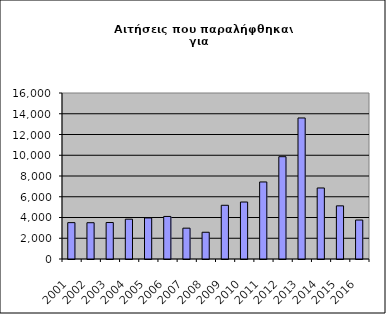
| Category | Series 0 |
|---|---|
| 2001.0 | 3505 |
| 2002.0 | 3497 |
| 2003.0 | 3516 |
| 2004.0 | 3838 |
| 2005.0 | 3956 |
| 2006.0 | 4101 |
| 2007.0 | 2972 |
| 2008.0 | 2577 |
| 2009.0 | 5177 |
| 2010.0 | 5491 |
| 2011.0 | 7426 |
| 2012.0 | 9860 |
| 2013.0 | 13592 |
| 2014.0 | 6846 |
| 2015.0 | 5123 |
| 2016.0 | 3755 |